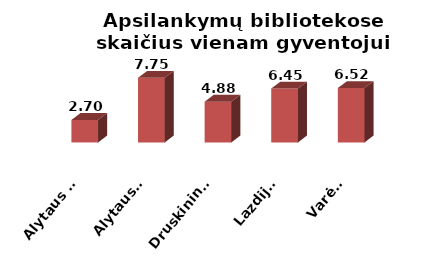
| Category | Series 0 |
|---|---|
| Alytaus m. | 2.7 |
| Alytaus r. | 7.747 |
| Druskininkai | 4.878 |
| Lazdijai | 6.45 |
| Varėna | 6.517 |